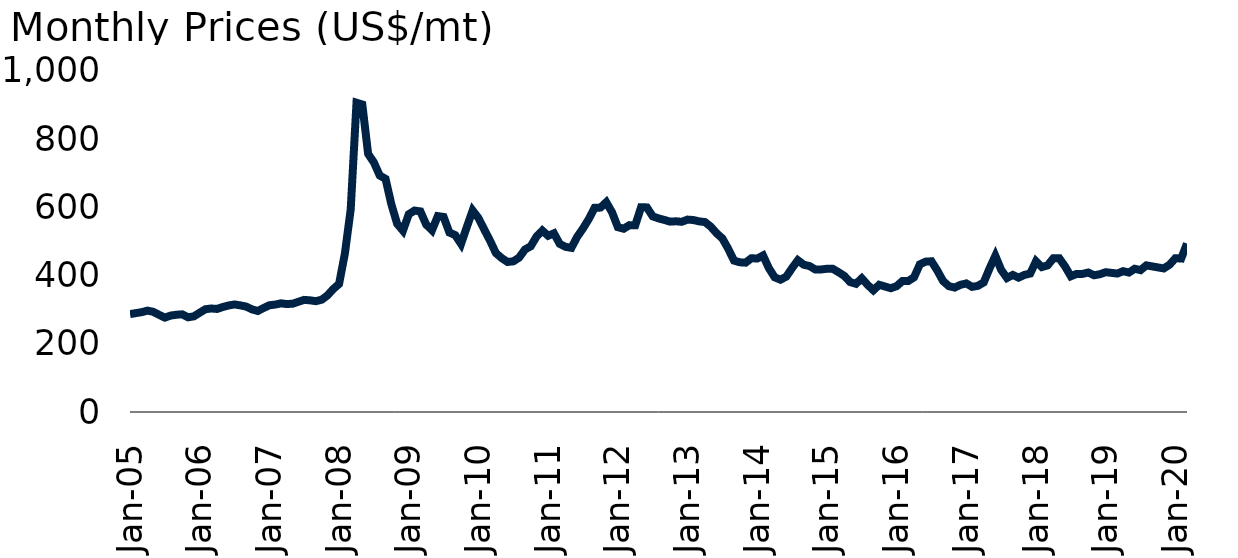
| Category | Rice |
|---|---|
| 2005-01-01 | 287 |
| 2005-02-01 | 290 |
| 2005-03-01 | 292.75 |
| 2005-04-01 | 297.25 |
| 2005-05-01 | 293.8 |
| 2005-06-01 | 285 |
| 2005-07-01 | 276.75 |
| 2005-08-01 | 282.8 |
| 2005-09-01 | 285.25 |
| 2005-10-01 | 286.4 |
| 2005-11-01 | 277.75 |
| 2005-12-01 | 280.5 |
| 2006-01-01 | 291.25 |
| 2006-02-01 | 301.5 |
| 2006-03-01 | 303.5 |
| 2006-04-01 | 302.25 |
| 2006-05-01 | 308 |
| 2006-06-01 | 312.5 |
| 2006-07-01 | 315.4 |
| 2006-08-01 | 312.667 |
| 2006-09-01 | 309.2 |
| 2006-10-01 | 301 |
| 2006-11-01 | 296.25 |
| 2006-12-01 | 305 |
| 2007-01-01 | 313 |
| 2007-02-01 | 315 |
| 2007-03-01 | 318.667 |
| 2007-04-01 | 316.5 |
| 2007-05-01 | 317.6 |
| 2007-06-01 | 323.25 |
| 2007-07-01 | 328.8 |
| 2007-08-01 | 327.5 |
| 2007-09-01 | 325 |
| 2007-10-01 | 329.2 |
| 2007-11-01 | 342 |
| 2007-12-01 | 360.667 |
| 2008-01-01 | 375.6 |
| 2008-02-01 | 464.75 |
| 2008-03-01 | 594 |
| 2008-04-01 | 907 |
| 2008-05-01 | 901.8 |
| 2008-06-01 | 757 |
| 2008-07-01 | 731.75 |
| 2008-08-01 | 693.5 |
| 2008-09-01 | 683.8 |
| 2008-10-01 | 609.25 |
| 2008-11-01 | 552 |
| 2008-12-01 | 531.8 |
| 2009-01-01 | 580 |
| 2009-02-01 | 590.75 |
| 2009-03-01 | 588.25 |
| 2009-04-01 | 549.667 |
| 2009-05-01 | 533 |
| 2009-06-01 | 574.5 |
| 2009-07-01 | 572 |
| 2009-08-01 | 526.25 |
| 2009-09-01 | 518.75 |
| 2009-10-01 | 493 |
| 2009-11-01 | 542.75 |
| 2009-12-01 | 591 |
| 2010-01-01 | 568.8 |
| 2010-02-01 | 535 |
| 2010-03-01 | 502.2 |
| 2010-04-01 | 466 |
| 2010-05-01 | 451.333 |
| 2010-06-01 | 440 |
| 2010-07-01 | 441.8 |
| 2010-08-01 | 452.75 |
| 2010-09-01 | 476.5 |
| 2010-10-01 | 486 |
| 2010-11-01 | 514.5 |
| 2010-12-01 | 532 |
| 2011-01-01 | 516.8 |
| 2011-02-01 | 524 |
| 2011-03-01 | 492.75 |
| 2011-04-01 | 484.25 |
| 2011-05-01 | 481.4 |
| 2011-06-01 | 513.75 |
| 2011-07-01 | 538.25 |
| 2011-08-01 | 566 |
| 2011-09-01 | 598.75 |
| 2011-10-01 | 599.4 |
| 2011-11-01 | 615.25 |
| 2011-12-01 | 585.75 |
| 2012-01-01 | 542 |
| 2012-02-01 | 537.5 |
| 2012-03-01 | 548 |
| 2012-04-01 | 547.75 |
| 2012-05-01 | 600.5 |
| 2012-06-01 | 600 |
| 2012-07-01 | 573.75 |
| 2012-08-01 | 567.75 |
| 2012-09-01 | 563.25 |
| 2012-10-01 | 558.25 |
| 2012-11-01 | 559.25 |
| 2012-12-01 | 557.8 |
| 2013-01-01 | 564.2 |
| 2013-02-01 | 563 |
| 2013-03-01 | 559 |
| 2013-04-01 | 557 |
| 2013-05-01 | 543.5 |
| 2013-06-01 | 524.25 |
| 2013-07-01 | 509 |
| 2013-08-01 | 478.75 |
| 2013-09-01 | 444 |
| 2013-10-01 | 439 |
| 2013-11-01 | 438 |
| 2013-12-01 | 451 |
| 2014-01-01 | 450 |
| 2014-02-01 | 459 |
| 2014-03-01 | 422 |
| 2014-04-01 | 395 |
| 2014-05-01 | 388 |
| 2014-06-01 | 397 |
| 2014-07-01 | 422 |
| 2014-08-01 | 445 |
| 2014-09-01 | 432 |
| 2014-10-01 | 428 |
| 2014-11-01 | 418 |
| 2014-12-01 | 418 |
| 2015-01-01 | 420 |
| 2015-02-01 | 420 |
| 2015-03-01 | 410 |
| 2015-04-01 | 399 |
| 2015-05-01 | 381 |
| 2015-06-01 | 376 |
| 2015-07-01 | 392 |
| 2015-08-01 | 373 |
| 2015-09-01 | 357 |
| 2015-10-01 | 373 |
| 2015-11-01 | 368 |
| 2015-12-01 | 363 |
| 2016-01-01 | 369 |
| 2016-02-01 | 384 |
| 2016-03-01 | 384 |
| 2016-04-01 | 395 |
| 2016-05-01 | 433 |
| 2016-06-01 | 441 |
| 2016-07-01 | 442 |
| 2016-08-01 | 415 |
| 2016-09-01 | 384 |
| 2016-10-01 | 369 |
| 2016-11-01 | 365 |
| 2016-12-01 | 373 |
| 2017-01-01 | 377 |
| 2017-02-01 | 367 |
| 2017-03-01 | 370 |
| 2017-04-01 | 380 |
| 2017-05-01 | 421 |
| 2017-06-01 | 458 |
| 2017-07-01 | 417 |
| 2017-08-01 | 393 |
| 2017-09-01 | 402 |
| 2017-10-01 | 394 |
| 2017-11-01 | 402 |
| 2017-12-01 | 406 |
| 2018-01-01 | 442 |
| 2018-02-01 | 425 |
| 2018-03-01 | 430 |
| 2018-04-01 | 451 |
| 2018-05-01 | 451 |
| 2018-06-01 | 427 |
| 2018-07-01 | 398 |
| 2018-08-01 | 405 |
| 2018-09-01 | 405 |
| 2018-10-01 | 409 |
| 2018-11-01 | 401 |
| 2018-12-01 | 404 |
| 2019-01-01 | 410 |
| 2019-02-01 | 408 |
| 2019-03-01 | 406 |
| 2019-04-01 | 413 |
| 2019-05-01 | 409 |
| 2019-06-01 | 420 |
| 2019-07-01 | 416 |
| 2019-08-01 | 430 |
| 2019-09-01 | 427 |
| 2019-10-01 | 424 |
| 2019-11-01 | 421 |
| 2019-12-01 | 432 |
| 2020-01-01 | 451 |
| 2020-02-01 | 450 |
| 2020-03-01 | 494 |